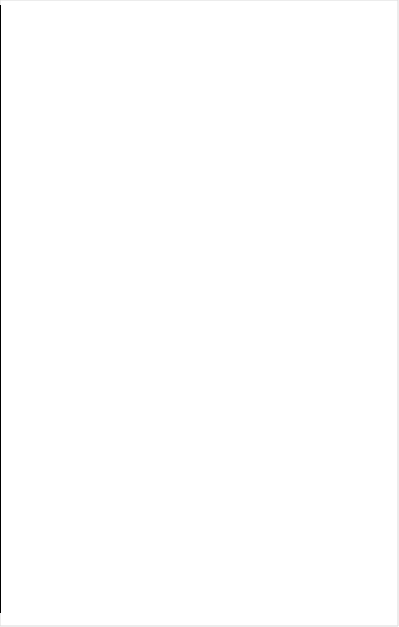
| Category | Activity description |
|---|---|
| 1.0 | 0 |
| 3.0 | 0 |
| 5.0 | 0 |
| 7.0 | 0 |
| 9.0 | 0 |
| 11.0 | 0 |
| 12.0 | 0 |
| 13.0 | 0 |
| 14.0 | 0 |
| 15.0 | 0 |
| 16.0 | 0 |
| 17.0 | 0 |
| 18.0 | 0 |
| 19.0 | 0 |
| 20.0 | 0 |
| 21.0 | 0 |
| 22.0 | 0 |
| 23.0 | 0 |
| 24.0 | 0 |
| 25.0 | 0 |
| 26.0 | 0 |
| 27.0 | 0 |
| 28.0 | 0 |
| 29.0 | 0 |
| 30.0 | 0 |